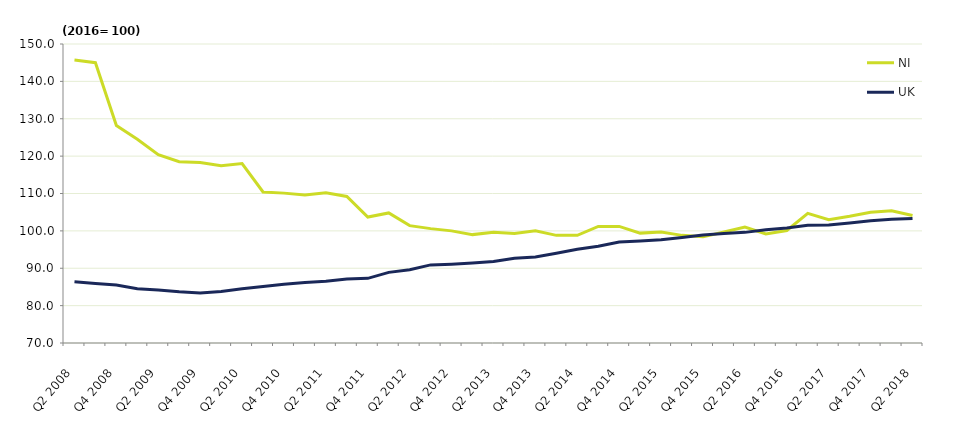
| Category | NI | UK |
|---|---|---|
| Q2 2008 | 145.7 | 86.4 |
| Q3 2008 | 145 | 85.9 |
| Q4 2008 | 128.2 | 85.5 |
| Q1 2009 | 124.5 | 84.5 |
| Q2 2009 | 120.4 | 84.2 |
| Q3 2009 | 118.5 | 83.7 |
| Q4 2009 | 118.3 | 83.4 |
| Q1 2010 | 117.4 | 83.8 |
| Q2 2010 | 118 | 84.5 |
| Q3 2010 | 110.4 | 85.1 |
| Q4 2010 | 110.1 | 85.7 |
| Q1 2011 | 109.6 | 86.2 |
| Q2 2011 | 110.2 | 86.5 |
| Q3 2011 | 109.2 | 87.1 |
| Q4 2011 | 103.7 | 87.3 |
| Q1 2012 | 104.8 | 88.9 |
| Q2 2012 | 101.4 | 89.6 |
| Q3 2012 | 100.6 | 90.9 |
| Q4 2012 | 100 | 91.1 |
| Q1 2013 | 99 | 91.4 |
| Q2 2013 | 99.6 | 91.8 |
| Q3 2013 | 99.3 | 92.7 |
| Q4 2013 | 100 | 93 |
| Q1 2014 | 98.8 | 94 |
| Q2 2014 | 98.8 | 95.1 |
| Q3 2014 | 101.2 | 95.9 |
| Q4 2014 | 101.2 | 97 |
| Q1 2015 | 99.4 | 97.3 |
| Q2 2015 | 99.7 | 97.6 |
| Q3 2015 | 98.8 | 98.2 |
| Q4 2015 | 98.4 | 98.9 |
| Q1 2016 | 99.7 | 99.3 |
| Q2 2016 | 101 | 99.6 |
| Q3 2016 | 99.2 | 100.3 |
| Q4 2016 | 100.1 | 100.8 |
| Q1 2017 | 104.7 | 101.5 |
| Q2 2017 | 103 | 101.6 |
| Q3 2017 | 103.9 | 102.1 |
| Q4 2017 | 105 | 102.7 |
| Q1 2018 | 105.4 | 103.1 |
| Q2 2018 | 104.1 | 103.3 |